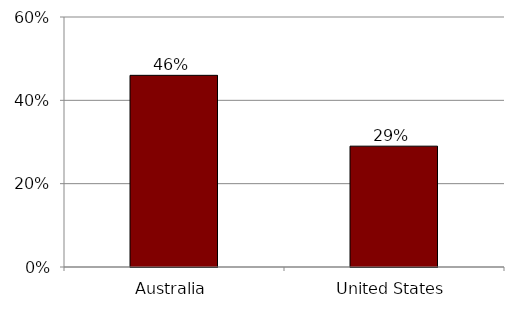
| Category | 2002 |
|---|---|
| Australia | 0.46 |
| United States | 0.29 |